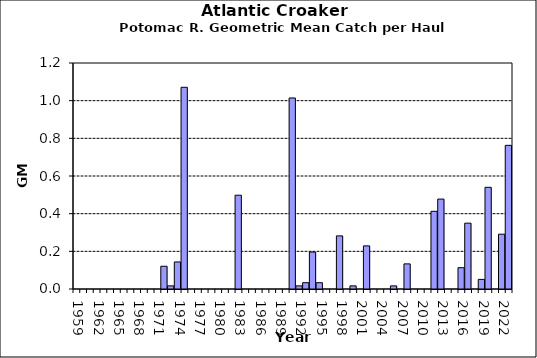
| Category | Series 0 |
|---|---|
| 1959.0 | 0 |
| 1960.0 | 0 |
| 1961.0 | 0 |
| 1962.0 | 0 |
| 1963.0 | 0 |
| 1964.0 | 0 |
| 1965.0 | 0 |
| 1966.0 | 0 |
| 1967.0 | 0 |
| 1968.0 | 0 |
| 1969.0 | 0 |
| 1970.0 | 0 |
| 1971.0 | 0 |
| 1972.0 | 0.121 |
| 1973.0 | 0.017 |
| 1974.0 | 0.144 |
| 1975.0 | 1.071 |
| 1976.0 | 0 |
| 1977.0 | 0 |
| 1978.0 | 0 |
| 1979.0 | 0 |
| 1980.0 | 0 |
| 1981.0 | 0 |
| 1982.0 | 0 |
| 1983.0 | 0.498 |
| 1984.0 | 0 |
| 1985.0 | 0 |
| 1986.0 | 0 |
| 1987.0 | 0 |
| 1988.0 | 0 |
| 1989.0 | 0 |
| 1990.0 | 0 |
| 1991.0 | 1.014 |
| 1992.0 | 0.017 |
| 1993.0 | 0.034 |
| 1994.0 | 0.196 |
| 1995.0 | 0.034 |
| 1996.0 | 0 |
| 1997.0 | 0 |
| 1998.0 | 0.282 |
| 1999.0 | 0 |
| 2000.0 | 0.017 |
| 2001.0 | 0 |
| 2002.0 | 0.229 |
| 2003.0 | 0 |
| 2004.0 | 0 |
| 2005.0 | 0 |
| 2006.0 | 0.017 |
| 2007.0 | 0 |
| 2008.0 | 0.133 |
| 2009.0 | 0 |
| 2010.0 | 0 |
| 2011.0 | 0 |
| 2012.0 | 0.413 |
| 2013.0 | 0.478 |
| 2014.0 | 0 |
| 2015.0 | 0 |
| 2016.0 | 0.113 |
| 2017.0 | 0.35 |
| 2018.0 | 0 |
| 2019.0 | 0.051 |
| 2020.0 | 0.54 |
| 2021.0 | 0 |
| 2022.0 | 0.291 |
| 2023.0 | 0.763 |